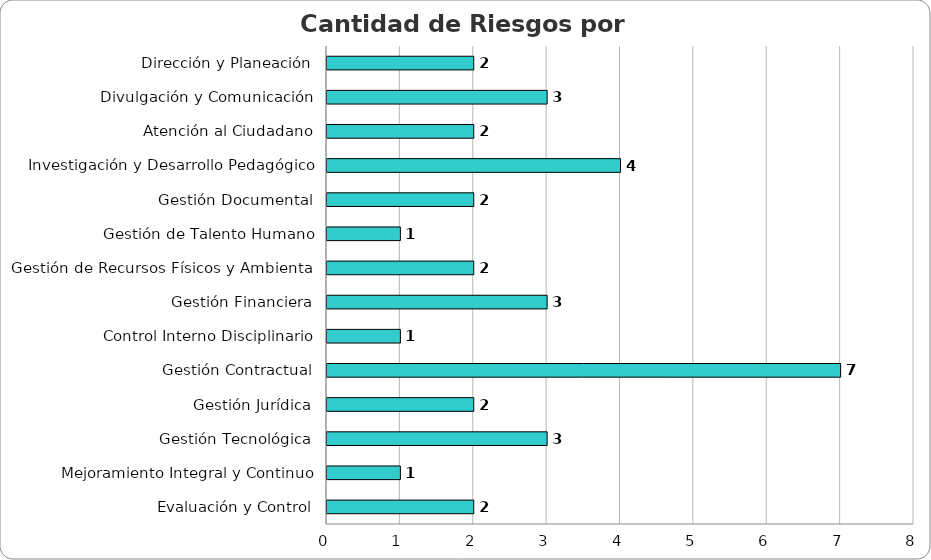
| Category | Series 0 |
|---|---|
| Dirección y Planeación | 2 |
| Divulgación y Comunicación | 3 |
| Atención al Ciudadano | 2 |
| Investigación y Desarrollo Pedagógico | 4 |
| Gestión Documental | 2 |
| Gestión de Talento Humano | 1 |
| Gestión de Recursos Físicos y Ambiental | 2 |
| Gestión Financiera | 3 |
| Control Interno Disciplinario | 1 |
| Gestión Contractual | 7 |
| Gestión Jurídica | 2 |
| Gestión Tecnológica | 3 |
| Mejoramiento Integral y Continuo | 1 |
| Evaluación y Control | 2 |